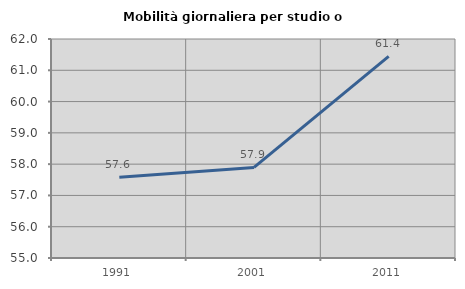
| Category | Mobilità giornaliera per studio o lavoro |
|---|---|
| 1991.0 | 57.579 |
| 2001.0 | 57.896 |
| 2011.0 | 61.447 |